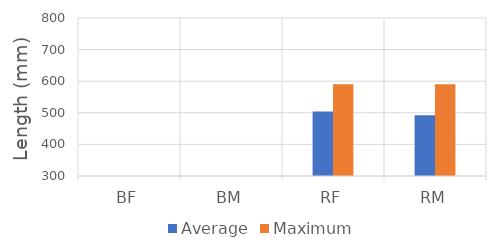
| Category | Average | Maximum |
|---|---|---|
| BF | 0 | 0 |
| BM | 0 | 0 |
| RF | 504 | 590 |
| RM | 492 | 590 |